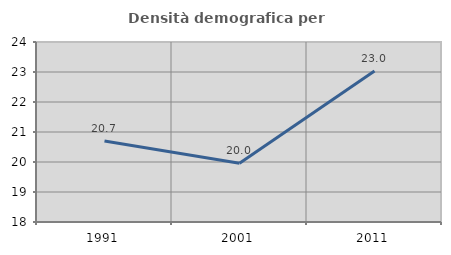
| Category | Densità demografica |
|---|---|
| 1991.0 | 20.699 |
| 2001.0 | 19.956 |
| 2011.0 | 23.034 |